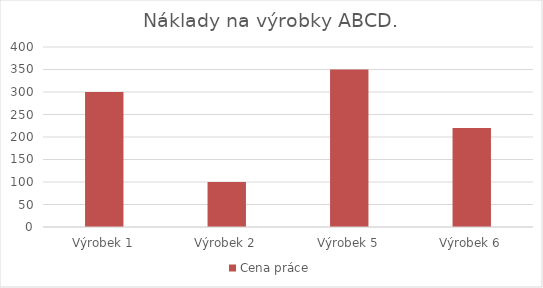
| Category | Cena práce |
|---|---|
| Výrobek 1 | 300 |
| Výrobek 2 | 100 |
| Výrobek 5 | 350 |
| Výrobek 6 | 220 |